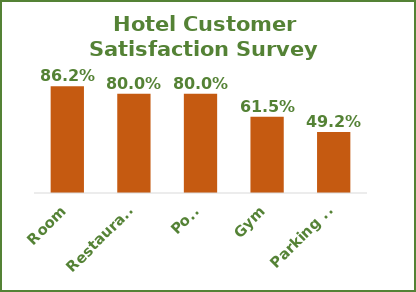
| Category | Series 0 |
|---|---|
| Room | 0.862 |
| Restaurant | 0.8 |
| Pool | 0.8 |
| Gym | 0.615 |
| Parking Lot | 0.492 |